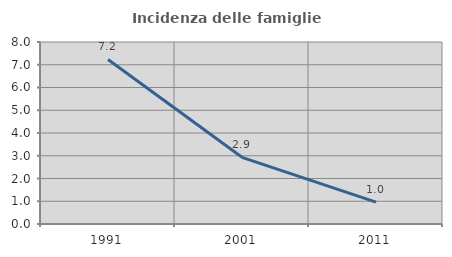
| Category | Incidenza delle famiglie numerose |
|---|---|
| 1991.0 | 7.233 |
| 2001.0 | 2.932 |
| 2011.0 | 0.959 |